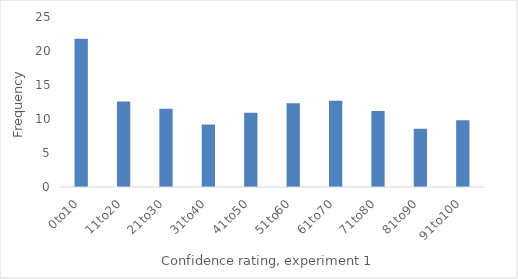
| Category | Series 0 |
|---|---|
| 0to10 | 21.812 |
| 11to20 | 12.562 |
| 21to30 | 11.5 |
| 31to40 | 9.188 |
| 41to50 | 10.938 |
| 51to60 | 12.312 |
| 61to70 | 12.688 |
| 71to80 | 11.188 |
| 81to90 | 8.562 |
| 91to100 | 9.8 |